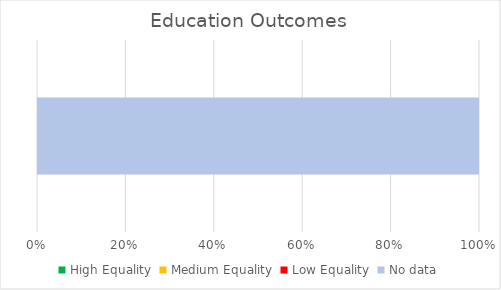
| Category | High Equality | Medium Equality | Low Equality | No data |
|---|---|---|---|---|
| 0 | 0 | 0 | 0 | 3 |